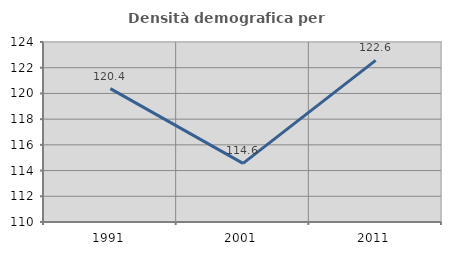
| Category | Densità demografica |
|---|---|
| 1991.0 | 120.37 |
| 2001.0 | 114.564 |
| 2011.0 | 122.567 |